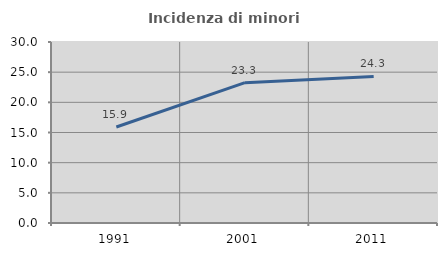
| Category | Incidenza di minori stranieri |
|---|---|
| 1991.0 | 15.909 |
| 2001.0 | 23.256 |
| 2011.0 | 24.302 |